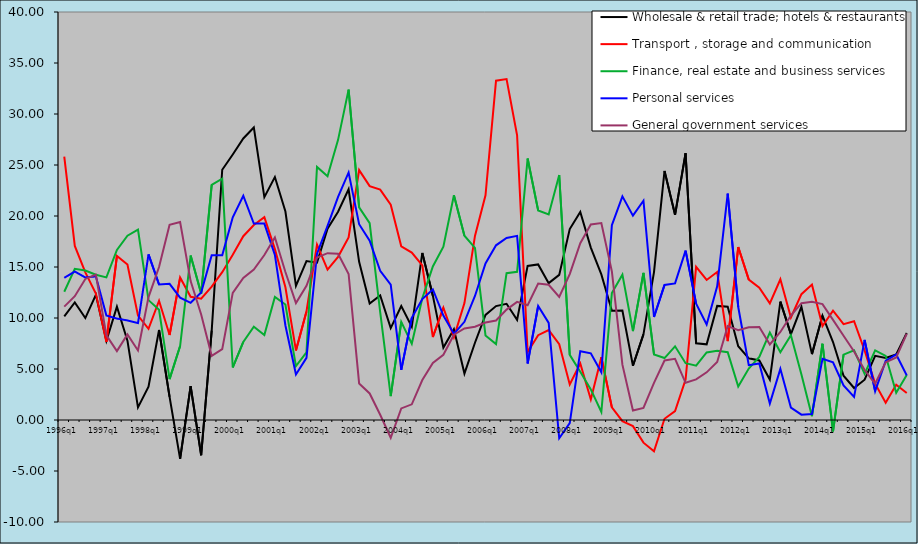
| Category | Wholesale & retail trade; hotels & restaurants | Transport , storage and communication | Finance, real estate and business services | Personal services | General government services |
|---|---|---|---|---|---|
| 1996q1 | 10.169 | 25.828 | 12.573 | 13.939 | 11.118 |
| 1996q2 | 11.524 | 17.066 | 14.82 | 14.557 | 12.142 |
| 1996q3 | 9.995 | 14.479 | 14.66 | 13.973 | 13.831 |
| 1996q4 | 12.271 | 12.388 | 14.241 | 14.079 | 14.261 |
| 1997q1 | 7.764 | 7.652 | 13.98 | 10.244 | 8.309 |
| 1997q2 | 11.116 | 16.088 | 16.668 | 9.942 | 6.757 |
| 1997q3 | 7.78 | 15.236 | 18.071 | 9.761 | 8.395 |
| 1997q4 | 1.239 | 10.245 | 18.666 | 9.501 | 6.82 |
| 1998q1 | 3.274 | 8.944 | 11.753 | 16.233 | 12.052 |
| 1998q2 | 8.821 | 11.689 | 10.804 | 13.283 | 15.001 |
| 1998q3 | 2.271 | 8.334 | 4.008 | 13.354 | 19.137 |
| 1998q4 | -3.816 | 13.964 | 7.251 | 11.998 | 19.406 |
| 1999q1 | 3.323 | 12.084 | 16.122 | 11.488 | 13.621 |
| 1999q2 | -3.454 | 11.895 | 12.394 | 12.509 | 10.352 |
| 1999q3 | 8.764 | 13.08 | 23.059 | 16.149 | 6.29 |
| 1999q4 | 24.53 | 14.493 | 23.656 | 16.157 | 6.944 |
| 2000q1 | 26.032 | 16.203 | 5.149 | 19.872 | 12.46 |
| 2000q2 | 27.603 | 18.019 | 7.65 | 21.991 | 13.931 |
| 2000q3 | 28.682 | 19.118 | 9.153 | 19.259 | 14.756 |
| 2000q4 | 21.849 | 19.879 | 8.322 | 19.258 | 16.18 |
| 2001q1 | 23.817 | 16.749 | 12.062 | 16.187 | 17.902 |
| 2001q2 | 20.439 | 13.014 | 11.323 | 9.264 | 14.506 |
| 2001q3 | 13.154 | 6.82 | 5.285 | 4.462 | 11.463 |
| 2001q4 | 15.579 | 10.645 | 6.626 | 6.093 | 13.148 |
| 2002q1 | 15.427 | 17.2 | 24.811 | 16.311 | 15.934 |
| 2002q2 | 18.765 | 14.739 | 23.901 | 19.035 | 16.354 |
| 2002q3 | 20.417 | 15.998 | 27.463 | 21.881 | 16.299 |
| 2002q4 | 22.617 | 17.899 | 32.391 | 24.267 | 14.318 |
| 2003q1 | 15.505 | 24.501 | 20.847 | 19.194 | 3.586 |
| 2003q2 | 11.415 | 22.927 | 19.298 | 17.579 | 2.603 |
| 2003q3 | 12.22 | 22.587 | 10.565 | 14.633 | 0.51 |
| 2003q4 | 9.012 | 21.105 | 2.339 | 13.262 | -1.739 |
| 2004q1 | 11.176 | 17.032 | 9.623 | 4.91 | 1.136 |
| 2004q2 | 9.142 | 16.417 | 7.477 | 10.015 | 1.536 |
| 2004q3 | 16.377 | 15.157 | 11.934 | 11.854 | 3.921 |
| 2004q4 | 12.189 | 8.134 | 15.048 | 12.797 | 5.59 |
| 2005q1 | 7.097 | 11.009 | 16.987 | 10.236 | 6.39 |
| 2005q2 | 8.901 | 8.097 | 22.04 | 8.441 | 8.362 |
| 2005q3 | 4.549 | 11.462 | 18.073 | 9.629 | 8.97 |
| 2005q4 | 7.576 | 18.045 | 16.881 | 12.16 | 9.149 |
| 2006q1 | 10.307 | 22.031 | 8.29 | 15.34 | 9.56 |
| 2006q2 | 11.171 | 33.267 | 7.446 | 17.126 | 9.755 |
| 2006q3 | 11.397 | 33.419 | 14.392 | 17.839 | 10.822 |
| 2006q4 | 9.814 | 27.914 | 14.53 | 18.054 | 11.581 |
| 2007q1 | 15.107 | 6.661 | 25.64 | 5.541 | 11.257 |
| 2007q2 | 15.256 | 8.317 | 20.549 | 11.176 | 13.376 |
| 2007q3 | 13.416 | 8.814 | 20.155 | 9.519 | 13.253 |
| 2007q4 | 14.225 | 7.43 | 24.017 | -1.792 | 12.067 |
| 2008q1 | 18.72 | 3.49 | 6.385 | -0.311 | 14.307 |
| 2008q2 | 20.403 | 5.538 | 4.735 | 6.75 | 17.329 |
| 2008q3 | 16.901 | 2.015 | 2.995 | 6.536 | 19.168 |
| 2008q4 | 14.276 | 6.163 | 0.785 | 4.682 | 19.301 |
| 2009q1 | 10.708 | 1.235 | 12.457 | 19.107 | 14.564 |
| 2009q2 | 10.724 | -0.11 | 14.246 | 21.926 | 5.427 |
| 2009q3 | 5.316 | -0.602 | 8.707 | 20.038 | 0.931 |
| 2009q4 | 8.394 | -2.22 | 14.423 | 21.496 | 1.191 |
| 2010q1 | 14.5 | -3.076 | 6.432 | 10.1 | 3.643 |
| 2010q2 | 24.415 | 0.119 | 6.073 | 13.246 | 5.835 |
| 2010q3 | 20.115 | 0.866 | 7.224 | 13.39 | 6.003 |
| 2010q4 | 26.157 | 3.962 | 5.567 | 16.602 | 3.648 |
| 2011q1 | 7.514 | 15.016 | 5.328 | 11.404 | 3.982 |
| 2011q2 | 7.417 | 13.731 | 6.621 | 9.359 | 4.672 |
| 2011q3 | 11.188 | 14.504 | 6.8 | 13.102 | 5.692 |
| 2011q4 | 11.11 | 7.736 | 6.653 | 22.187 | 9.215 |
| 2012q1 | 7.228 | 16.956 | 3.279 | 11.079 | 8.796 |
| 2012q2 | 6.05 | 13.759 | 5.038 | 5.376 | 9.089 |
| 2012q3 | 5.837 | 12.968 | 6.175 | 5.549 | 9.128 |
| 2012q4 | 3.961 | 11.433 | 8.578 | 1.607 | 7.4 |
| 2013q1 | 11.6 | 13.801 | 6.635 | 5.015 | 8.631 |
| 2013q2 | 8.418 | 10.049 | 8.306 | 1.212 | 10.245 |
| 2013q3 | 11.099 | 12.34 | 4.469 | 0.527 | 11.457 |
| 2013q4 | 6.457 | 13.271 | 0.378 | 0.585 | 11.58 |
| 2014q1 | 10.239 | 9.205 | 7.476 | 5.997 | 11.364 |
| 2014q2 | 7.645 | 10.719 | -1.121 | 5.653 | 9.812 |
| 2014q3 | 4.345 | 9.399 | 6.41 | 3.381 | 8.267 |
| 2014q4 | 3.137 | 9.687 | 6.837 | 2.261 | 6.722 |
| 2015q1 | 3.953 | 6.816 | 4.518 | 7.855 | 4.902 |
| 2015q2 | 6.29 | 3.566 | 6.831 | 2.825 | 3.55 |
| 2015q3 | 6.073 | 1.699 | 6.291 | 5.802 | 5.655 |
| 2015q4 | 6.436 | 3.465 | 2.664 | 6.426 | 6.136 |
| 2016q1 | 8.534 | 2.652 | 4.404 | 4.376 | 8.457 |